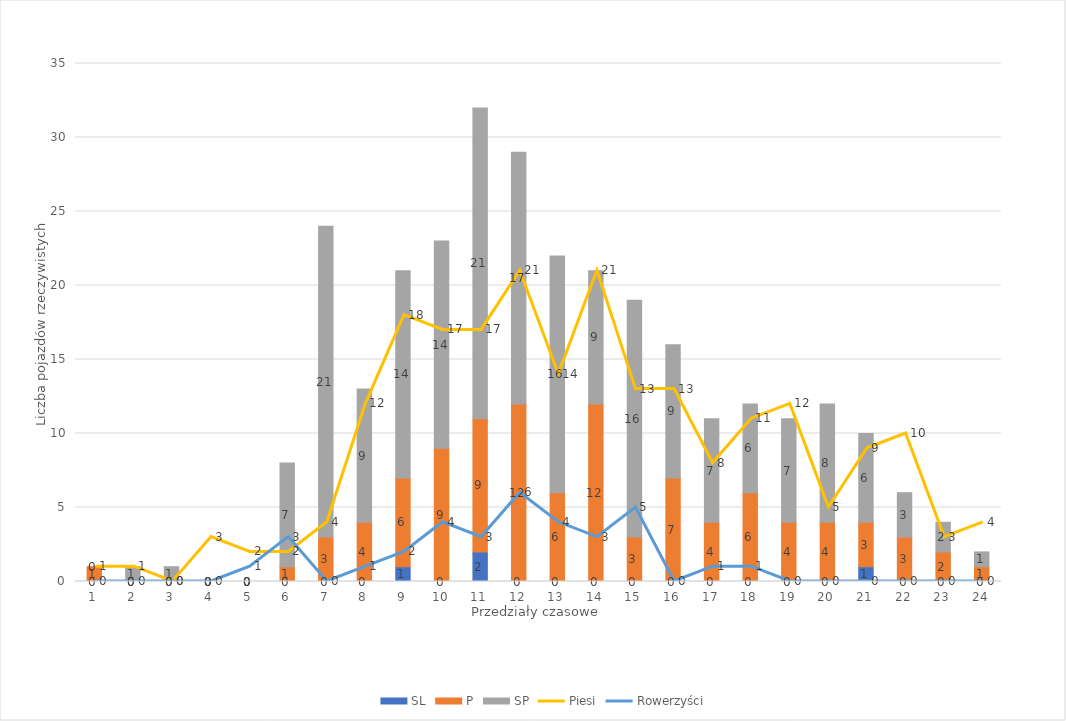
| Category | SL | P | SP |
|---|---|---|---|
| 0 | 0 | 1 | 0 |
| 1 | 0 | 0 | 1 |
| 2 | 0 | 0 | 1 |
| 3 | 0 | 0 | 0 |
| 4 | 0 | 0 | 0 |
| 5 | 0 | 1 | 7 |
| 6 | 0 | 3 | 21 |
| 7 | 0 | 4 | 9 |
| 8 | 1 | 6 | 14 |
| 9 | 0 | 9 | 14 |
| 10 | 2 | 9 | 21 |
| 11 | 0 | 12 | 17 |
| 12 | 0 | 6 | 16 |
| 13 | 0 | 12 | 9 |
| 14 | 0 | 3 | 16 |
| 15 | 0 | 7 | 9 |
| 16 | 0 | 4 | 7 |
| 17 | 0 | 6 | 6 |
| 18 | 0 | 4 | 7 |
| 19 | 0 | 4 | 8 |
| 20 | 1 | 3 | 6 |
| 21 | 0 | 3 | 3 |
| 22 | 0 | 2 | 2 |
| 23 | 0 | 1 | 1 |